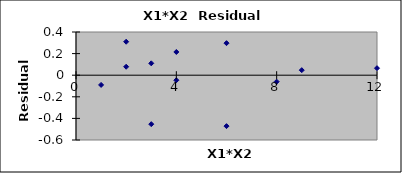
| Category | Series 0 |
|---|---|
| 1.0 | -0.09 |
| 2.0 | 0.078 |
| 3.0 | -0.453 |
| 4.0 | 0.215 |
| 2.0 | 0.31 |
| 4.0 | -0.047 |
| 6.0 | 0.297 |
| 8.0 | -0.06 |
| 3.0 | 0.11 |
| 6.0 | -0.472 |
| 9.0 | 0.047 |
| 12.0 | 0.065 |